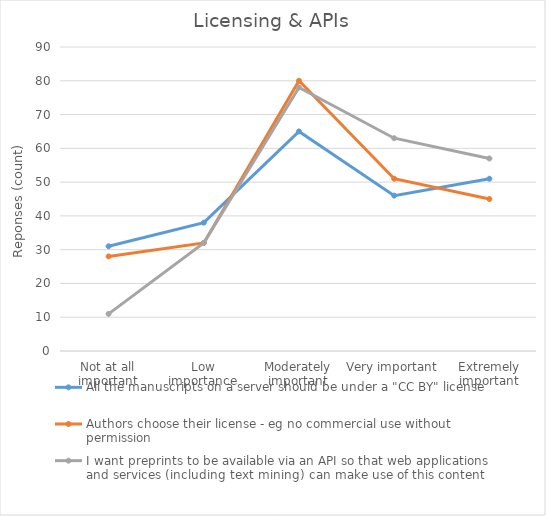
| Category | All the manuscripts on a server should be under a "CC BY" license | Authors choose their license - eg no commercial use without permission | I want preprints to be available via an API so that web applications and services (including text mining) can make use of this content |
|---|---|---|---|
| Not at all important | 31 | 28 | 11 |
| Low importance | 38 | 32 | 32 |
| Moderately important | 65 | 80 | 78 |
| Very important | 46 | 51 | 63 |
| Extremely important | 51 | 45 | 57 |